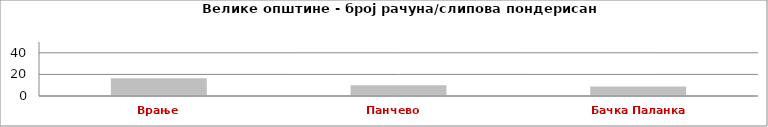
| Category | Series 0 |
|---|---|
| Врање | 16.535 |
| Панчево   | 9.858 |
| Бачка Паланка   | 8.784 |